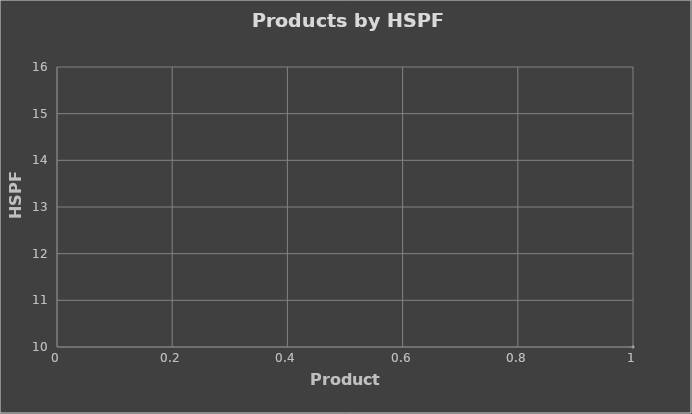
| Category | Series 0 |
|---|---|
| 0 | 10 |
| 1 | 10 |
| 2 | 10 |
| 3 | 10 |
| 4 | 10 |
| 5 | 10 |
| 6 | 10 |
| 7 | 10 |
| 8 | 10 |
| 9 | 10 |
| 10 | 10 |
| 11 | 10 |
| 12 | 10 |
| 13 | 10 |
| 14 | 10 |
| 15 | 10 |
| 16 | 10 |
| 17 | 10 |
| 18 | 10 |
| 19 | 10 |
| 20 | 10 |
| 21 | 10 |
| 22 | 10 |
| 23 | 10 |
| 24 | 10 |
| 25 | 10 |
| 26 | 10 |
| 27 | 10 |
| 28 | 10 |
| 29 | 13 |
| 30 | 12 |
| 31 | 11.6 |
| 32 | 11.3 |
| 33 | 13.5 |
| 34 | 12.5 |
| 35 | 13.5 |
| 36 | 12.5 |
| 37 | 12.5 |
| 38 | 11.5 |
| 39 | 12 |
| 40 | 11 |
| 41 | 12 |
| 42 | 11 |
| 43 | 12.8 |
| 44 | 12.5 |
| 45 | 11.7 |
| 46 | 11.2 |
| 47 | 10 |
| 48 | 10 |
| 49 | 10 |
| 50 | 11 |
| 51 | 11.3 |
| 52 | 10.7 |
| 53 | 11 |
| 54 | 10.5 |
| 55 | 10.5 |
| 56 | 11.5 |
| 57 | 11 |
| 58 | 11.7 |
| 59 | 11.4 |
| 60 | 11.2 |
| 61 | 10.4 |
| 62 | 10.4 |
| 63 | 10 |
| 64 | 11 |
| 65 | 10 |
| 66 | 10 |
| 67 | 14.5 |
| 68 | 13.6 |
| 69 | 10.5 |
| 70 | 11 |
| 71 | 12 |
| 72 | 10.5 |
| 73 | 10 |
| 74 | 10 |
| 75 | 10 |
| 76 | 10 |
| 77 | 12 |
| 78 | 10.5 |
| 79 | 10.5 |
| 80 | 10.5 |
| 81 | 10.5 |
| 82 | 10.5 |
| 83 | 11 |
| 84 | 11 |
| 85 | 11 |
| 86 | 11 |
| 87 | 11 |
| 88 | 11.5 |
| 89 | 11.5 |
| 90 | 11 |
| 91 | 11.5 |
| 92 | 11.5 |
| 93 | 10 |
| 94 | 10 |
| 95 | 10 |
| 96 | 10.5 |
| 97 | 10.5 |
| 98 | 10.5 |
| 99 | 10.5 |
| 100 | 10.5 |
| 101 | 10.5 |
| 102 | 11 |
| 103 | 11 |
| 104 | 11 |
| 105 | 10.5 |
| 106 | 10.5 |
| 107 | 10.5 |
| 108 | 10.5 |
| 109 | 10.5 |
| 110 | 11 |
| 111 | 11 |
| 112 | 11 |
| 113 | 11 |
| 114 | 11 |
| 115 | 11 |
| 116 | 11 |
| 117 | 11 |
| 118 | 11 |
| 119 | 11 |
| 120 | 11 |
| 121 | 11 |
| 122 | 11 |
| 123 | 11 |
| 124 | 11 |
| 125 | 11 |
| 126 | 11.5 |
| 127 | 11.5 |
| 128 | 11.5 |
| 129 | 11.5 |
| 130 | 11.5 |
| 131 | 11.5 |
| 132 | 11.5 |
| 133 | 11.5 |
| 134 | 11.5 |
| 135 | 11.5 |
| 136 | 11.5 |
| 137 | 11.5 |
| 138 | 10.5 |
| 139 | 10.5 |
| 140 | 10.5 |
| 141 | 10.5 |
| 142 | 10.5 |
| 143 | 10.5 |
| 144 | 11 |
| 145 | 11 |
| 146 | 11 |
| 147 | 11 |
| 148 | 11 |
| 149 | 11 |
| 150 | 10.5 |
| 151 | 10.5 |
| 152 | 10.5 |
| 153 | 10.5 |
| 154 | 11 |
| 155 | 11 |
| 156 | 11 |
| 157 | 11 |
| 158 | 11 |
| 159 | 11 |
| 160 | 11 |
| 161 | 13 |
| 162 | 10.5 |
| 163 | 10.5 |
| 164 | 11.5 |
| 165 | 11 |
| 166 | 11.5 |
| 167 | 11.5 |
| 168 | 11.5 |
| 169 | 11.5 |
| 170 | 11 |
| 171 | 11 |
| 172 | 11 |
| 173 | 10.5 |
| 174 | 10.5 |
| 175 | 11 |
| 176 | 11 |
| 177 | 11 |
| 178 | 11 |
| 179 | 11 |
| 180 | 11.5 |
| 181 | 10.5 |
| 182 | 10.5 |
| 183 | 10.5 |
| 184 | 10.5 |
| 185 | 11 |
| 186 | 11 |
| 187 | 10.5 |
| 188 | 11 |
| 189 | 11 |
| 190 | 11 |
| 191 | 11.5 |
| 192 | 11.5 |
| 193 | 11.5 |
| 194 | 11.5 |
| 195 | 11.5 |
| 196 | 11 |
| 197 | 11.5 |
| 198 | 11.5 |
| 199 | 11 |
| 200 | 11.5 |
| 201 | 11.5 |
| 202 | 10.5 |
| 203 | 10.5 |
| 204 | 11 |
| 205 | 11 |
| 206 | 11 |
| 207 | 11 |
| 208 | 11 |
| 209 | 11 |
| 210 | 10.5 |
| 211 | 11 |
| 212 | 11 |
| 213 | 10.5 |
| 214 | 10.5 |
| 215 | 10.5 |
| 216 | 11 |
| 217 | 11 |
| 218 | 10.5 |
| 219 | 11 |
| 220 | 11 |
| 221 | 11 |
| 222 | 11.5 |
| 223 | 11.5 |
| 224 | 12 |
| 225 | 11 |
| 226 | 10.5 |
| 227 | 11 |
| 228 | 11 |
| 229 | 10.5 |
| 230 | 10.5 |
| 231 | 10.5 |
| 232 | 12 |
| 233 | 15 |
| 234 | 14 |
| 235 | 12 |
| 236 | 13 |
| 237 | 12.5 |
| 238 | 13 |
| 239 | 10.3 |
| 240 | 12 |
| 241 | 11.2 |
| 242 | 10.5 |
| 243 | 10.5 |
| 244 | 10.5 |
| 245 | 10.3 |
| 246 | 10.3 |
| 247 | 10.5 |
| 248 | 10.5 |
| 249 | 10.2 |
| 250 | 10.2 |
| 251 | 10 |
| 252 | 10 |
| 253 | 10 |
| 254 | 10 |
| 255 | 12 |
| 256 | 10.5 |
| 257 | 10.5 |
| 258 | 10.5 |
| 259 | 10.5 |
| 260 | 10.5 |
| 261 | 11 |
| 262 | 11 |
| 263 | 11 |
| 264 | 11 |
| 265 | 11 |
| 266 | 11.5 |
| 267 | 11.5 |
| 268 | 11 |
| 269 | 11.5 |
| 270 | 11.5 |
| 271 | 10 |
| 272 | 10 |
| 273 | 10 |
| 274 | 10.5 |
| 275 | 10.5 |
| 276 | 10.5 |
| 277 | 10.5 |
| 278 | 10.5 |
| 279 | 10.5 |
| 280 | 11 |
| 281 | 11 |
| 282 | 11 |
| 283 | 10.5 |
| 284 | 10.5 |
| 285 | 10.5 |
| 286 | 10.5 |
| 287 | 10.5 |
| 288 | 11 |
| 289 | 11 |
| 290 | 11 |
| 291 | 11 |
| 292 | 11 |
| 293 | 11 |
| 294 | 11 |
| 295 | 11 |
| 296 | 11 |
| 297 | 11 |
| 298 | 11 |
| 299 | 11 |
| 300 | 11 |
| 301 | 11 |
| 302 | 11 |
| 303 | 11 |
| 304 | 11.5 |
| 305 | 11.5 |
| 306 | 11.5 |
| 307 | 11.5 |
| 308 | 11.5 |
| 309 | 11.5 |
| 310 | 11.5 |
| 311 | 11.5 |
| 312 | 11.5 |
| 313 | 11.5 |
| 314 | 11.5 |
| 315 | 11.5 |
| 316 | 10.5 |
| 317 | 10.5 |
| 318 | 10.5 |
| 319 | 10.5 |
| 320 | 10.5 |
| 321 | 10.5 |
| 322 | 11 |
| 323 | 11 |
| 324 | 11 |
| 325 | 11 |
| 326 | 11 |
| 327 | 11 |
| 328 | 10.5 |
| 329 | 10.5 |
| 330 | 10.5 |
| 331 | 10.5 |
| 332 | 11 |
| 333 | 11 |
| 334 | 11 |
| 335 | 11 |
| 336 | 11 |
| 337 | 11 |
| 338 | 11 |
| 339 | 11 |
| 340 | 13 |
| 341 | 10.5 |
| 342 | 10.5 |
| 343 | 11.5 |
| 344 | 11 |
| 345 | 11.5 |
| 346 | 11.5 |
| 347 | 11.5 |
| 348 | 11.5 |
| 349 | 11 |
| 350 | 11 |
| 351 | 11 |
| 352 | 10.5 |
| 353 | 10.5 |
| 354 | 11 |
| 355 | 11 |
| 356 | 11 |
| 357 | 11 |
| 358 | 11 |
| 359 | 11.5 |
| 360 | 10.5 |
| 361 | 10.5 |
| 362 | 10.5 |
| 363 | 10.5 |
| 364 | 11 |
| 365 | 11 |
| 366 | 10.5 |
| 367 | 11 |
| 368 | 11 |
| 369 | 11 |
| 370 | 11.5 |
| 371 | 11.5 |
| 372 | 11.5 |
| 373 | 11.5 |
| 374 | 11.5 |
| 375 | 11 |
| 376 | 11.5 |
| 377 | 11.5 |
| 378 | 11 |
| 379 | 11.5 |
| 380 | 11.5 |
| 381 | 10.5 |
| 382 | 10.5 |
| 383 | 11 |
| 384 | 11 |
| 385 | 11 |
| 386 | 11 |
| 387 | 11 |
| 388 | 11 |
| 389 | 10.5 |
| 390 | 11 |
| 391 | 11 |
| 392 | 10.5 |
| 393 | 10.5 |
| 394 | 10.5 |
| 395 | 11 |
| 396 | 11 |
| 397 | 10.5 |
| 398 | 11 |
| 399 | 11 |
| 400 | 11 |
| 401 | 11.5 |
| 402 | 11.5 |
| 403 | 12 |
| 404 | 11 |
| 405 | 10.5 |
| 406 | 11 |
| 407 | 11 |
| 408 | 10.5 |
| 409 | 10.5 |
| 410 | 10.5 |
| 411 | 12 |
| 412 | 12 |
| 413 | 12 |
| 414 | 12 |
| 415 | 12 |
| 416 | 11 |
| 417 | 11 |
| 418 | 11 |
| 419 | 11 |
| 420 | 12 |
| 421 | 12 |
| 422 | 12 |
| 423 | 12 |
| 424 | 12.5 |
| 425 | 12.5 |
| 426 | 12.5 |
| 427 | 12.5 |
| 428 | 10.5 |
| 429 | 10.5 |
| 430 | 10.5 |
| 431 | 10.5 |
| 432 | 15 |
| 433 | 14 |
| 434 | 10.3 |
| 435 | 10.3 |
| 436 | 10.3 |
| 437 | 11.2 |
| 438 | 12 |
| 439 | 10.3 |
| 440 | 10.5 |
| 441 | 14.5 |
| 442 | 13.6 |
| 443 | 10.5 |
| 444 | 11 |
| 445 | 12 |
| 446 | 10.1 |
| 447 | 11 |
| 448 | 11.7 |
| 449 | 11.2 |
| 450 | 10 |
| 451 | 10.3 |
| 452 | 12.5 |
| 453 | 12.5 |
| 454 | 10.3 |
| 455 | 11 |
| 456 | 10.55 |
| 457 | 10 |
| 458 | 12.5 |
| 459 | 12.5 |
| 460 | 11.6 |
| 461 | 11 |
| 462 | 10.6 |
| 463 | 10.7 |
| 464 | 12.5 |
| 465 | 12.5 |
| 466 | 11.3 |
| 467 | 12 |
| 468 | 11.7 |
| 469 | 12.5 |
| 470 | 10.3 |
| 471 | 12.5 |
| 472 | 11.7 |
| 473 | 11.2 |
| 474 | 11 |
| 475 | 10.1 |
| 476 | 10 |
| 477 | 10 |
| 478 | 10 |
| 479 | 10 |
| 480 | 10 |
| 481 | 14.5 |
| 482 | 13.6 |
| 483 | 10.5 |
| 484 | 11 |
| 485 | 12 |
| 486 | 10.5 |
| 487 | 11.2 |
| 488 | 10 |
| 489 | 10 |
| 490 | 10.5 |
| 491 | 10.1 |
| 492 | 10 |